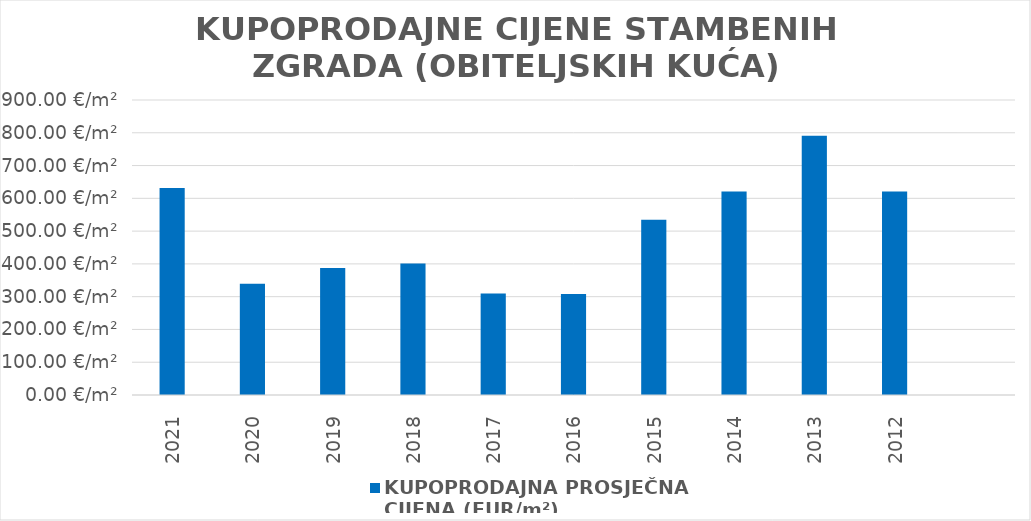
| Category | KUPOPRODAJNA PROSJEČNA 
CIJENA (EUR/m²) |
|---|---|
| 2021 | 1901-09-22 11:01:32 |
| 2020 | 1900-12-04 09:25:49 |
| 2019 | 1901-01-21 08:23:46 |
| 2018 | 1901-02-04 06:03:39 |
| 2017 | 1900-11-04 22:46:02 |
| 2016 | 1900-11-03 08:41:42 |
| 2015 | 1901-06-17 13:46:09 |
| 2014 | 1901-09-11 17:36:40 |
| 2013 | 1902-03-01 05:49:55 |
| 2012 | 1901-09-11 12:48:47 |